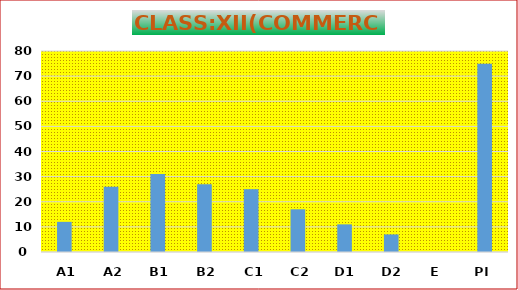
| Category | Series 0 |
|---|---|
| A1 | 12 |
| A2 | 26 |
| B1 | 31 |
| B2 | 27 |
| C1 | 25 |
| C2 | 17 |
| D1 | 11 |
| D2 | 7 |
| E | 0 |
| PI | 74.9 |